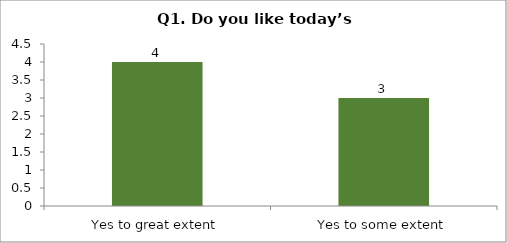
| Category | Q1. Do you like today’s session? |
|---|---|
| Yes to great extent | 4 |
| Yes to some extent | 3 |